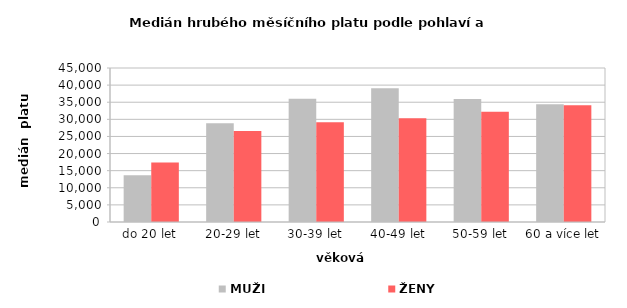
| Category | MUŽI | ŽENY |
|---|---|---|
| 0 | 13653.496 | 17353.154 |
| 1 | 28880.38 | 26558.272 |
| 2 | 35988.049 | 29152.215 |
| 3 | 39087.279 | 30327.778 |
| 4 | 35964.96 | 32242.937 |
| 5 | 34374.479 | 34107.582 |